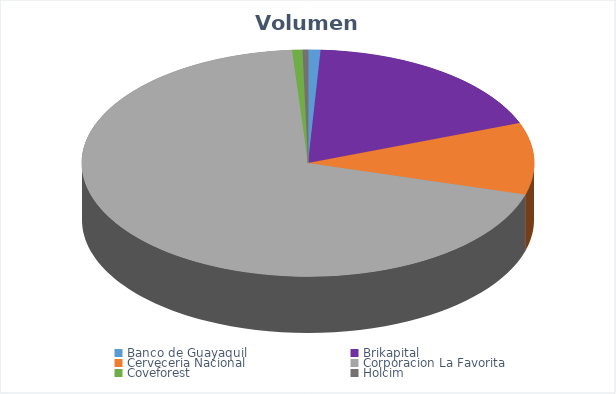
| Category | VOLUMEN ($USD) |
|---|---|
| Banco de Guayaquil | 4834.08 |
| Brikapital | 100000 |
| Cerveceria Nacional | 55710 |
| Corporacion La Favorita | 378102.52 |
| Coveforest | 4001.4 |
| Holcim | 2100 |